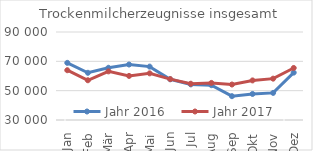
| Category | Jahr 2016 | Jahr 2017 |
|---|---|---|
| Jan | 68964.193 | 63939.395 |
| Feb | 62189.245 | 57093.049 |
| Mär | 65613.064 | 63152.677 |
| Apr | 67834.137 | 60064.552 |
| Mai | 66398.165 | 61814.562 |
| Jun | 57777.818 | 57885.988 |
| Jul | 54274.535 | 54727.248 |
| Aug | 53737.485 | 55280.583 |
| Sep | 46239.592 | 54194.033 |
| Okt | 47758.854 | 56986.236 |
| Nov | 48477.417 | 58191.941 |
| Dez | 62315.258 | 65482.287 |